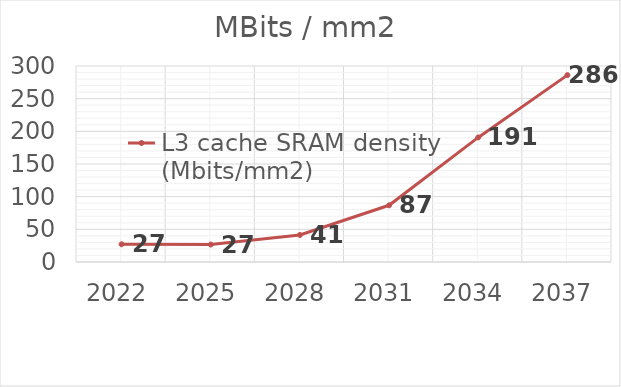
| Category | L3 cache SRAM density (Mbits/mm2) |
|---|---|
| 2022.0 | 27.127 |
| 2025.0 | 26.709 |
| 2028.0 | 41.336 |
| 2031.0 | 86.806 |
| 2034.0 | 190.694 |
| 2037.0 | 286.041 |